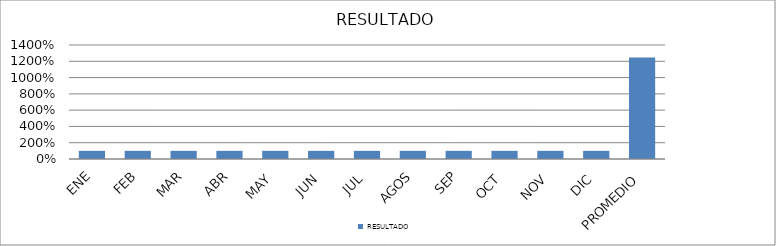
| Category | RESULTADO |
|---|---|
| ENE | 1 |
| FEB | 1 |
| MAR | 1 |
| ABR | 1 |
| MAY | 1 |
| JUN | 1 |
| JUL | 1 |
| AGOS | 1 |
| SEP | 1 |
| OCT | 1 |
| NOV | 1 |
| DIC | 1 |
| PROMEDIO | 12.476 |